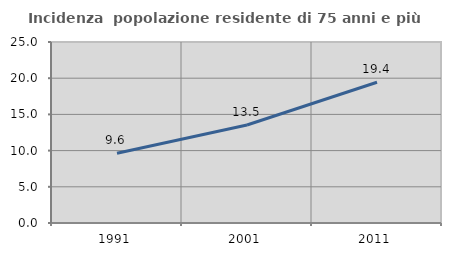
| Category | Incidenza  popolazione residente di 75 anni e più |
|---|---|
| 1991.0 | 9.633 |
| 2001.0 | 13.529 |
| 2011.0 | 19.435 |